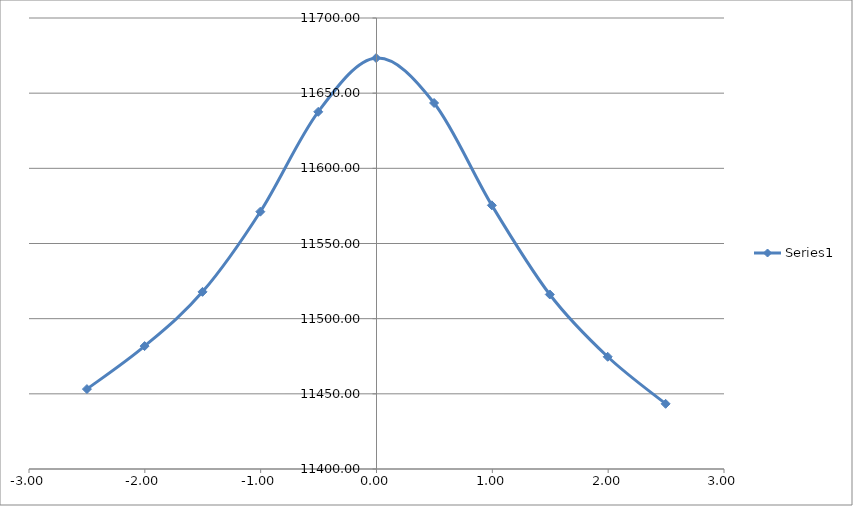
| Category | Series 0 |
|---|---|
| -2.5 | 11453.155 |
| -2.002 | 11481.748 |
| -1.5019999999999998 | 11517.836 |
| -1.0030000000000001 | 11571.162 |
| -0.5030000000000001 | 11637.606 |
| -0.0030000000000001137 | 11673.353 |
| 0.4969999999999999 | 11643.474 |
| 0.9959999999999996 | 11575.386 |
| 1.4959999999999996 | 11516.094 |
| 1.9959999999999996 | 11474.656 |
| 2.4959999999999996 | 11443.361 |